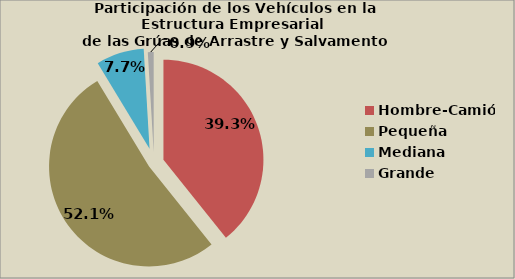
| Category | Series 0 |
|---|---|
| Hombre-Camión | 39.284 |
| Pequeña | 52.1 |
| Mediana | 7.737 |
| Grande | 0.936 |